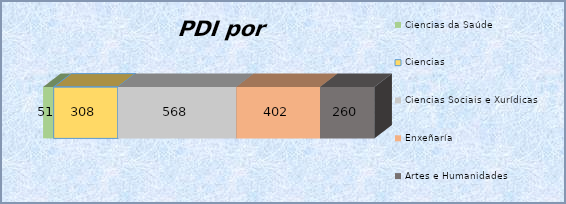
| Category | Ciencias da Saúde | Ciencias | Ciencias Sociais e Xurídicas | Enxeñaría | Artes e Humanidades |
|---|---|---|---|---|---|
| 0 | 51 | 308 | 568 | 402 | 260 |